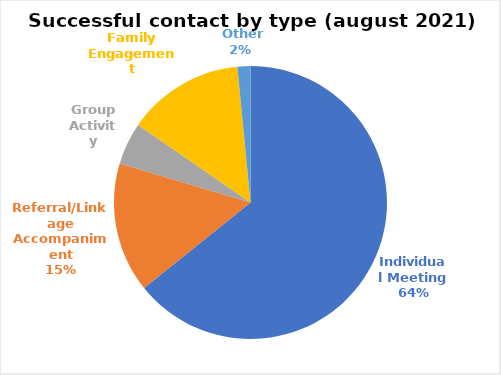
| Category | Series 0 |
|---|---|
| Individual Meeting | 167 |
| Referral/Linkage Accompaniment | 40 |
| Group Activity | 13 |
| Family Engagement | 36 |
|  Other | 4 |